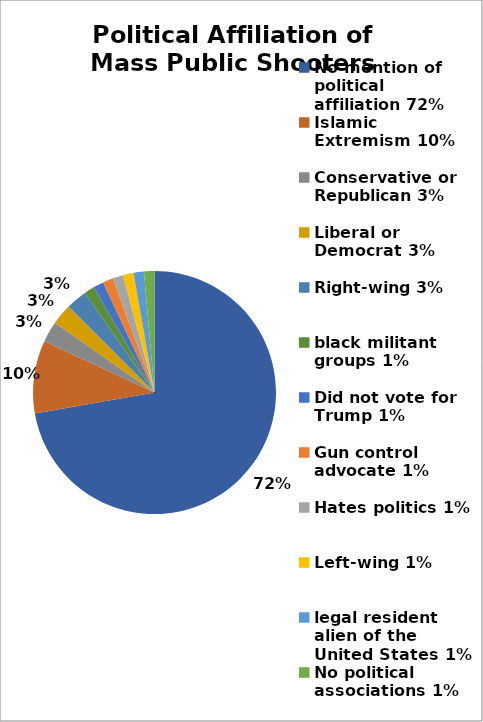
| Category | Series 0 |
|---|---|
| No mention of political affiliation 72% | 0.722 |
| Islamic Extremism 10% | 0.097 |
| Conservative or Republican 3% | 0.028 |
| Liberal or Democrat 3% | 0.028 |
| Right-wing 3% | 0.028 |
| black militant groups 1% | 0.014 |
| Did not vote for Trump 1% | 0.014 |
| Gun control advocate 1% | 0.014 |
| Hates politics 1% | 0.014 |
| Left-wing 1% | 0.014 |
| legal resident alien of the United States 1% | 0.014 |
| No political associations 1% | 0.014 |